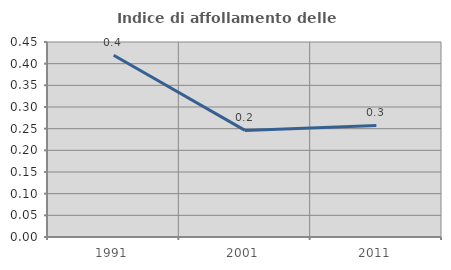
| Category | Indice di affollamento delle abitazioni  |
|---|---|
| 1991.0 | 0.419 |
| 2001.0 | 0.246 |
| 2011.0 | 0.258 |